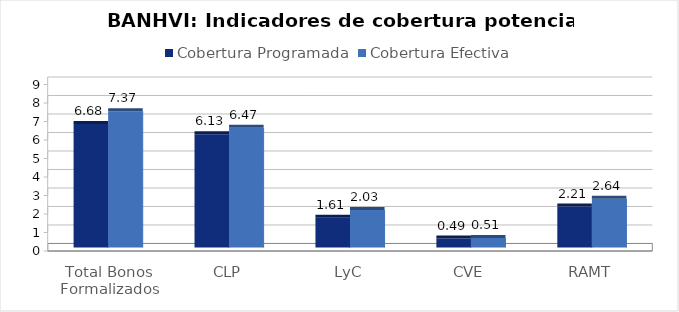
| Category | Cobertura Programada | Cobertura Efectiva |
|---|---|---|
| Total Bonos Formalizados | 6.677 | 7.369 |
| CLP | 6.126 | 6.469 |
| LyC | 1.609 | 2.026 |
| CVE | 0.487 | 0.511 |
| RAMT | 2.214 | 2.638 |